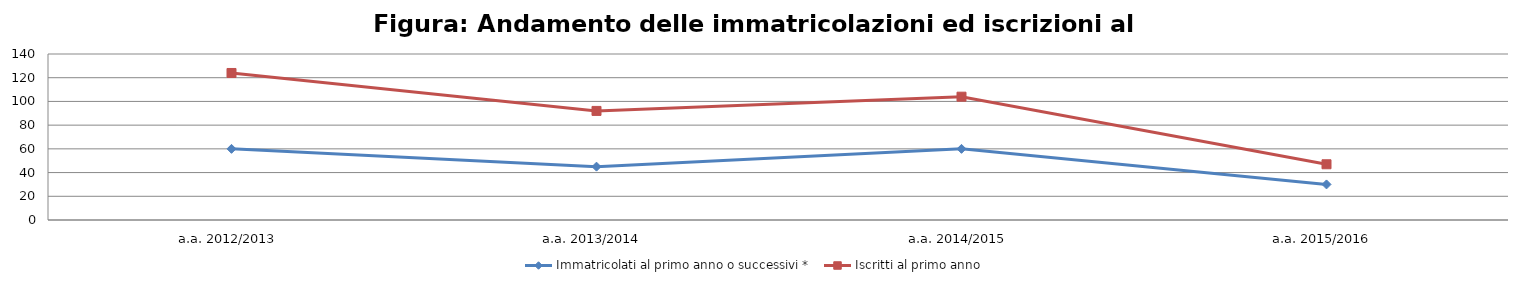
| Category | Immatricolati al primo anno o successivi * | Iscritti al primo anno  |
|---|---|---|
| a.a. 2012/2013 | 60 | 124 |
| a.a. 2013/2014 | 45 | 92 |
| a.a. 2014/2015 | 60 | 104 |
| a.a. 2015/2016 | 30 | 47 |